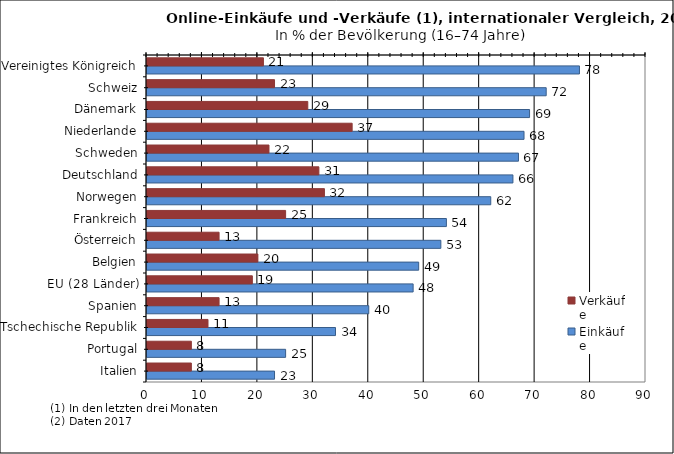
| Category | Einkäufe | Verkäufe |
|---|---|---|
| Italien | 23 | 8 |
| Portugal | 25 | 8 |
| Tschechische Republik | 34 | 11 |
| Spanien | 40 | 13 |
| EU (28 Länder) | 48 | 19 |
| Belgien | 49 | 20 |
| Österreich | 53 | 13 |
| Frankreich | 54 | 25 |
| Norwegen | 62 | 32 |
| Deutschland | 66 | 31 |
| Schweden | 67 | 22 |
| Niederlande | 68 | 37 |
| Dänemark | 69 | 29 |
| Schweiz | 72 | 23 |
| Vereinigtes Königreich | 78 | 21 |